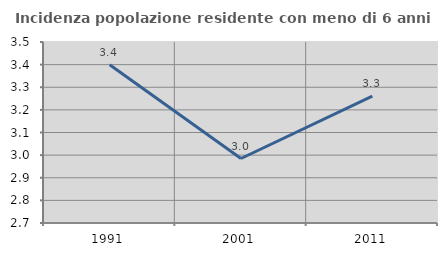
| Category | Incidenza popolazione residente con meno di 6 anni |
|---|---|
| 1991.0 | 3.399 |
| 2001.0 | 2.985 |
| 2011.0 | 3.261 |